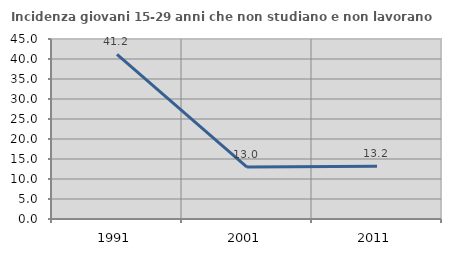
| Category | Incidenza giovani 15-29 anni che non studiano e non lavorano  |
|---|---|
| 1991.0 | 41.176 |
| 2001.0 | 12.99 |
| 2011.0 | 13.156 |